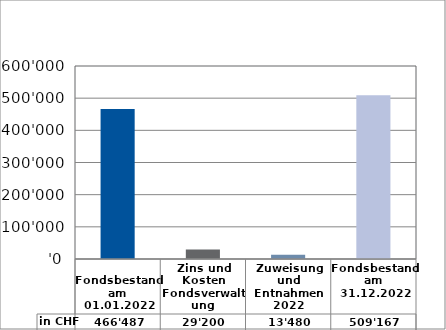
| Category | in CHF |
|---|---|
| 
Fondsbestand am 01.01.2022

 | 466487 |
| Zins und Kosten Fondsverwaltung | 29200 |
| Zuweisung und Entnahmen 2022 | 13480 |
| Fondsbestand am 31.12.2022 | 509167 |